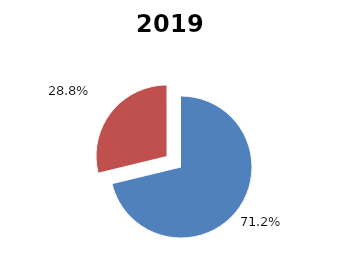
| Category | 2019 |
|---|---|
| Zuzeneko kudeaketaren bilketa | 2807277 |
| Zerga doikuntzak | 1133854.996 |